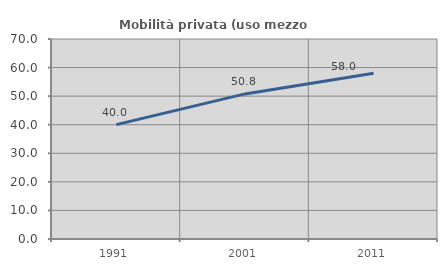
| Category | Mobilità privata (uso mezzo privato) |
|---|---|
| 1991.0 | 40.02 |
| 2001.0 | 50.784 |
| 2011.0 | 58.049 |